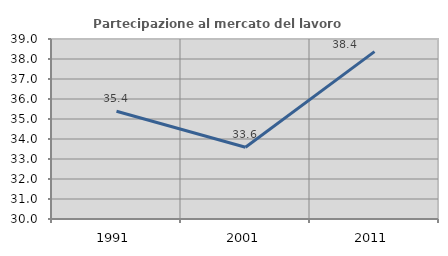
| Category | Partecipazione al mercato del lavoro  femminile |
|---|---|
| 1991.0 | 35.388 |
| 2001.0 | 33.587 |
| 2011.0 | 38.369 |